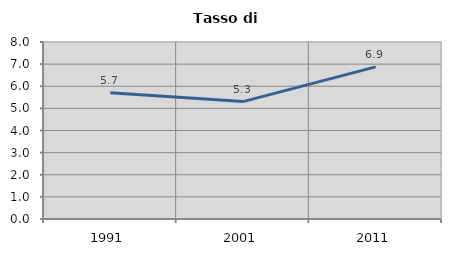
| Category | Tasso di disoccupazione   |
|---|---|
| 1991.0 | 5.701 |
| 2001.0 | 5.306 |
| 2011.0 | 6.877 |